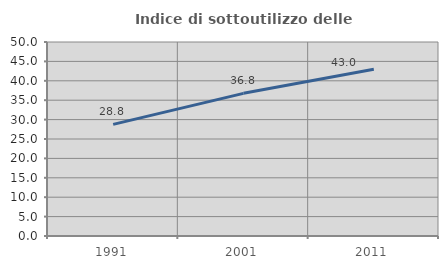
| Category | Indice di sottoutilizzo delle abitazioni  |
|---|---|
| 1991.0 | 28.763 |
| 2001.0 | 36.77 |
| 2011.0 | 42.954 |